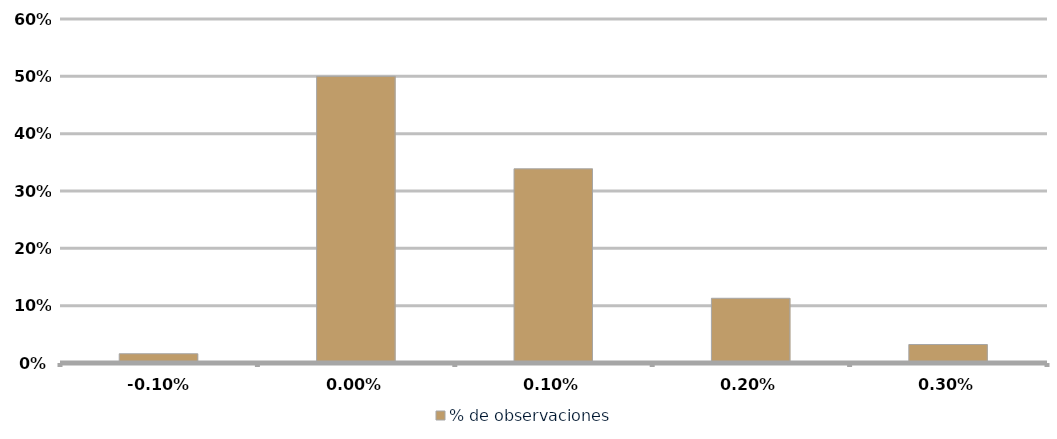
| Category | % de observaciones  |
|---|---|
| -0.001 | 0.016 |
| 0.0 | 0.5 |
| 0.001 | 0.339 |
| 0.002 | 0.113 |
| 0.003 | 0.032 |